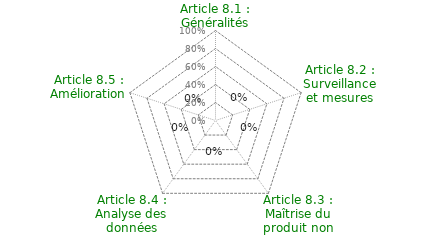
| Category | Article 8 : Mesures, analyse et amélioration |
|---|---|
| Article 8.1 : Généralités | 0 |
| Article 8.2 : Surveillance et mesures | 0 |
| Article 8.3 : Maîtrise du produit non conforme | 0 |
| Article 8.4 : Analyse des données | 0 |
| Article 8.5 : Amélioration | 0 |